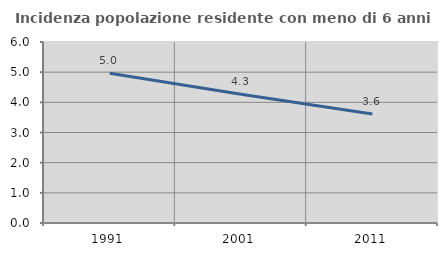
| Category | Incidenza popolazione residente con meno di 6 anni |
|---|---|
| 1991.0 | 4.965 |
| 2001.0 | 4.27 |
| 2011.0 | 3.614 |